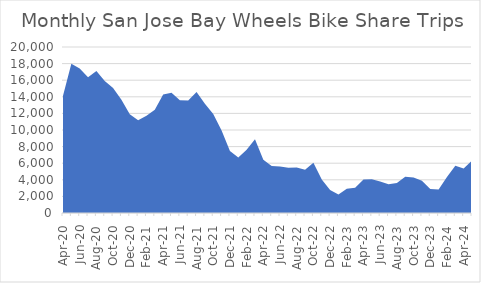
| Category | San Jose |
|---|---|
| 2020-04-01 | 14117 |
| 2020-05-01 | 17968 |
| 2020-06-01 | 17423 |
| 2020-07-01 | 16370 |
| 2020-08-01 | 17123 |
| 2020-09-01 | 15911 |
| 2020-10-01 | 15048 |
| 2020-11-01 | 13635 |
| 2020-12-01 | 11884 |
| 2021-01-01 | 11182 |
| 2021-02-01 | 11708 |
| 2021-03-01 | 12440 |
| 2021-04-01 | 14263 |
| 2021-05-01 | 14492 |
| 2021-06-01 | 13589 |
| 2021-07-01 | 13555 |
| 2021-08-01 | 14572 |
| 2021-09-01 | 13152 |
| 2021-10-01 | 11923 |
| 2021-11-01 | 9927 |
| 2021-12-01 | 7474 |
| 2022-01-01 | 6680 |
| 2022-02-01 | 7615 |
| 2022-03-01 | 8886 |
| 2022-04-01 | 6405 |
| 2022-05-01 | 5660 |
| 2022-06-01 | 5593 |
| 2022-07-01 | 5451 |
| 2022-08-01 | 5478 |
| 2022-09-01 | 5204 |
| 2022-10-01 | 6058 |
| 2022-11-01 | 4044 |
| 2022-12-01 | 2761 |
| 2023-01-01 | 2224 |
| 2023-02-01 | 2935 |
| 2023-03-01 | 3037 |
| 2023-04-01 | 4045 |
| 2023-05-01 | 4076 |
| 2023-06-01 | 3800 |
| 2023-07-01 | 3472 |
| 2023-08-01 | 3605 |
| 2023-09-01 | 4356 |
| 2023-10-01 | 4289 |
| 2023-11-01 | 3871 |
| 2023-12-01 | 2882 |
| 2024-01-01 | 2846 |
| 2024-02-01 | 4328 |
| 2024-03-01 | 5701 |
| 2024-04-01 | 5347 |
| 2024-05-01 | 6329 |